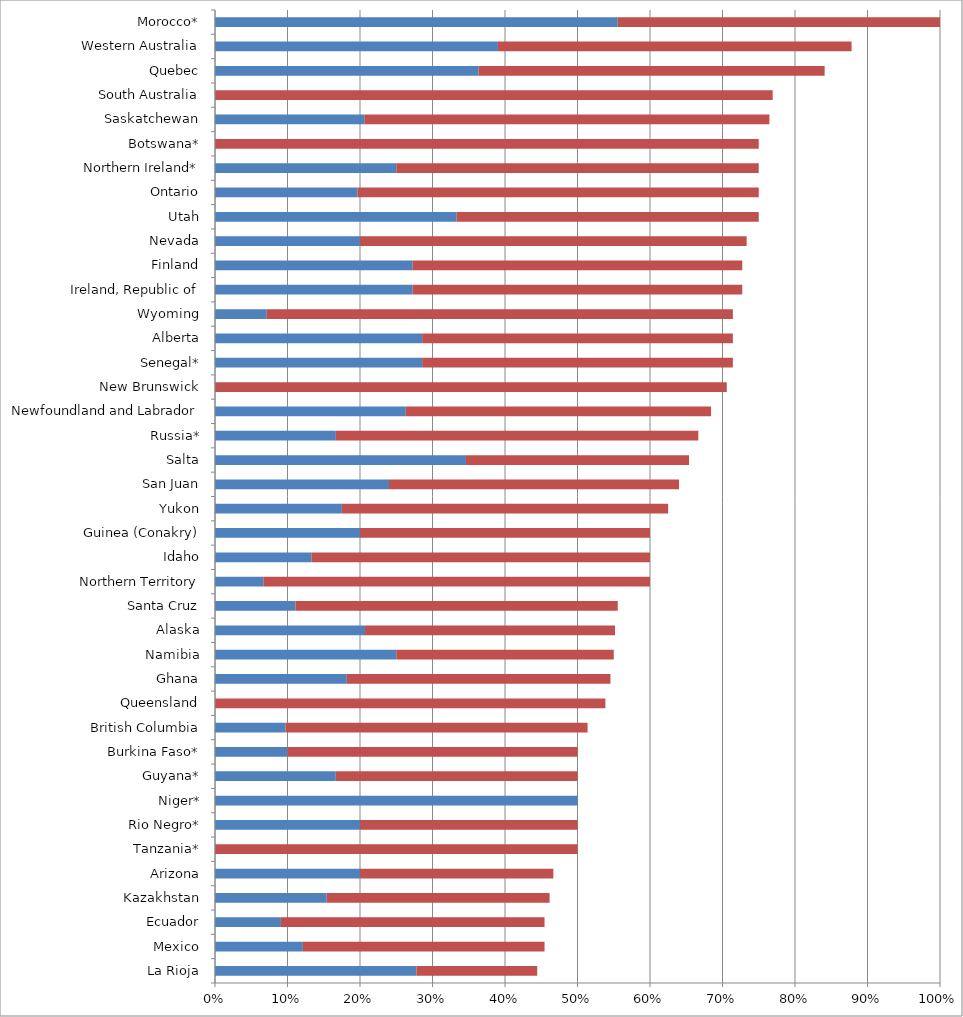
| Category | Series 0 | Series 1 |
|---|---|---|
| La Rioja | 0.278 | 0.167 |
| Mexico | 0.121 | 0.333 |
| Ecuador | 0.091 | 0.364 |
| Kazakhstan | 0.154 | 0.308 |
| Arizona | 0.2 | 0.267 |
| Tanzania* | 0 | 0.5 |
| Rio Negro* | 0.2 | 0.3 |
| Niger* | 0.5 | 0 |
| Guyana* | 0.167 | 0.333 |
| Burkina Faso* | 0.1 | 0.4 |
| British Columbia | 0.097 | 0.417 |
| Queensland | 0 | 0.538 |
| Ghana | 0.182 | 0.364 |
| Namibia | 0.25 | 0.3 |
| Alaska | 0.207 | 0.345 |
| Santa Cruz | 0.111 | 0.444 |
| Northern Territory | 0.067 | 0.533 |
| Idaho | 0.133 | 0.467 |
| Guinea (Conakry) | 0.2 | 0.4 |
| Yukon | 0.175 | 0.45 |
| San Juan | 0.24 | 0.4 |
| Salta | 0.346 | 0.308 |
| Russia* | 0.167 | 0.5 |
| Newfoundland and Labrador | 0.263 | 0.421 |
| New Brunswick | 0 | 0.706 |
| Senegal* | 0.286 | 0.429 |
| Alberta | 0.286 | 0.429 |
| Wyoming | 0.071 | 0.643 |
| Ireland, Republic of | 0.273 | 0.455 |
| Finland | 0.273 | 0.455 |
| Nevada | 0.2 | 0.533 |
| Utah | 0.333 | 0.417 |
| Ontario | 0.196 | 0.554 |
| Northern Ireland* | 0.25 | 0.5 |
| Botswana* | 0 | 0.75 |
| Saskatchewan | 0.206 | 0.559 |
| South Australia | 0 | 0.769 |
| Quebec | 0.364 | 0.477 |
| Western Australia | 0.39 | 0.488 |
| Morocco* | 0.556 | 0.444 |